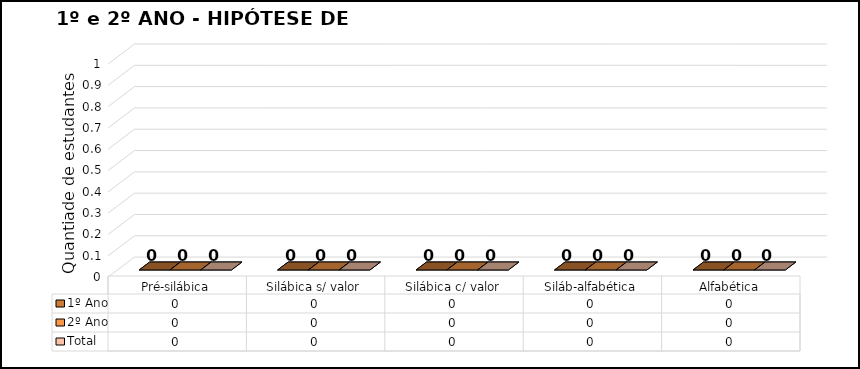
| Category | 1º Ano | 2º Ano | Total |
|---|---|---|---|
| Pré-silábica | 0 | 0 | 0 |
| Silábica s/ valor | 0 | 0 | 0 |
| Silábica c/ valor | 0 | 0 | 0 |
| Siláb-alfabética | 0 | 0 | 0 |
| Alfabética | 0 | 0 | 0 |